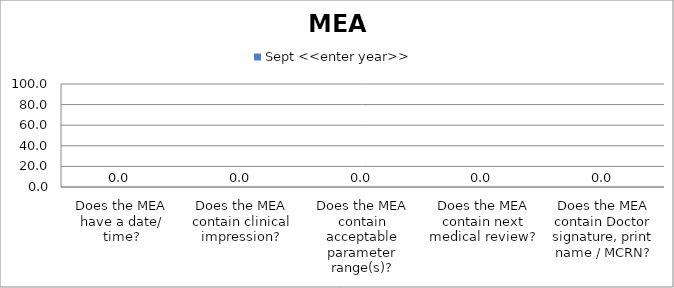
| Category | Sept <<enter year>> |
|---|---|
| Does the MEA have a date/ time? | 0 |
| Does the MEA contain clinical impression? | 0 |
| Does the MEA contain acceptable parameter range(s)? | 0 |
| Does the MEA contain next medical review? | 0 |
| Does the MEA contain Doctor signature, print name / MCRN? | 0 |